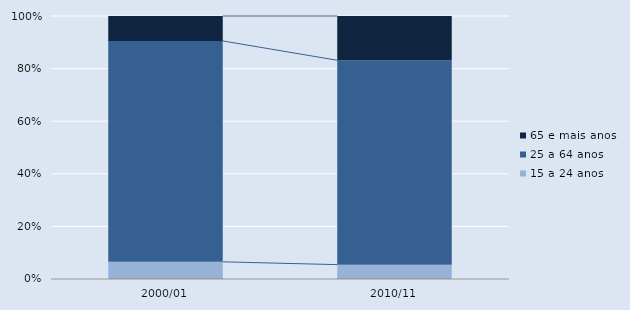
| Category | 15 a 24 anos | 25 a 64 anos | 65 e mais anos |
|---|---|---|---|
| 2000/01 | 0.065 | 0.84 | 0.095 |
| 2010/11 | 0.055 | 0.777 | 0.168 |